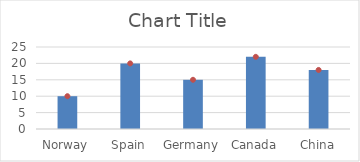
| Category | Series 0 |
|---|---|
| Norway | 10 |
| Spain | 20 |
| Germany | 15 |
| Canada | 22 |
| China | 18 |